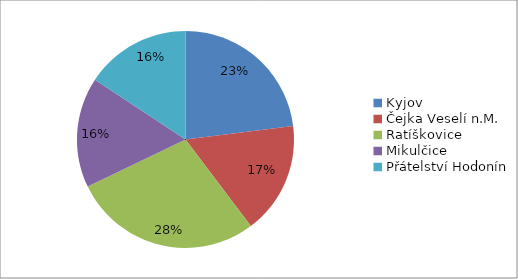
| Category | Series 0 |
|---|---|
| Kyjov | 161 |
| Čejka Veselí n.M. | 117 |
| Ratíškovice | 197 |
| Mikulčice | 115 |
| Přátelství Hodonín | 110 |